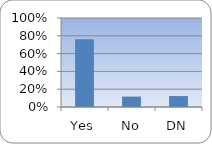
| Category | Series 0 |
|---|---|
| Yes | 0.76 |
| No | 0.117 |
| DN | 0.123 |